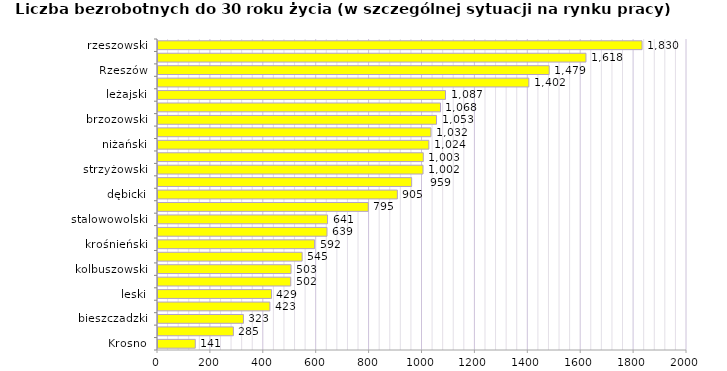
| Category | Liczba bezrobotnych do 30 roku życia - w szczególnej sytuacji na rynku pracy |
|---|---|
| Krosno | 141 |
| Tarnobrzeg | 285 |
| bieszczadzki | 323 |
| tarnobrzeski  | 423 |
| leski | 429 |
| lubaczowski | 502 |
| kolbuszowski | 503 |
| Przemyśl | 545 |
| krośnieński | 592 |
| sanocki | 639 |
| stalowowolski | 641 |
| mielecki | 795 |
| dębicki | 905 |
| łańcucki | 959 |
| strzyżowski | 1002 |
| ropczycko-sędziszowski | 1003 |
| niżański | 1024 |
| przemyski | 1032 |
| brzozowski | 1053 |
| przeworski | 1068 |
| leżajski | 1087 |
| jasielski | 1402 |
| Rzeszów | 1479 |
| jarosławski | 1618 |
| rzeszowski | 1830 |